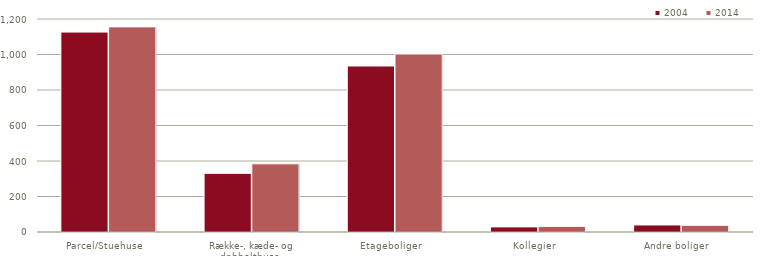
| Category | 2004 | 2014 |
|---|---|---|
| Parcel/Stuehuse   | 1126.381 | 1155.592 |
| Række-, kæde- og dobbelthuse   | 330.567 | 384.072 |
| Etageboliger   | 935.268 | 1002.953 |
| Kollegier   | 28.829 | 31.642 |
| Andre boliger   | 39.71 | 37.79 |